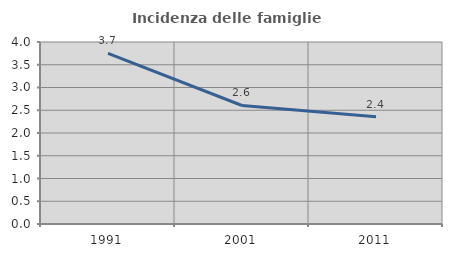
| Category | Incidenza delle famiglie numerose |
|---|---|
| 1991.0 | 3.749 |
| 2001.0 | 2.605 |
| 2011.0 | 2.356 |